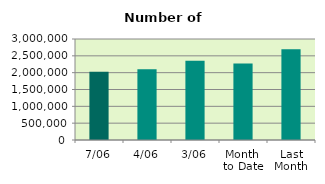
| Category | Series 0 |
|---|---|
| 7/06 | 2024574 |
| 4/06 | 2100736 |
| 3/06 | 2355280 |
| Month 
to Date | 2269477.2 |
| Last
Month | 2692139.333 |